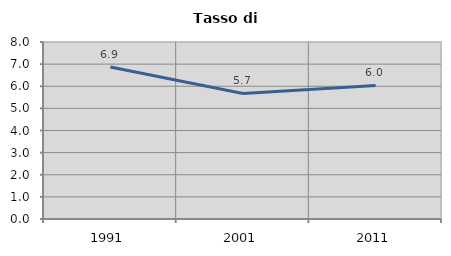
| Category | Tasso di disoccupazione   |
|---|---|
| 1991.0 | 6.871 |
| 2001.0 | 5.676 |
| 2011.0 | 6.036 |